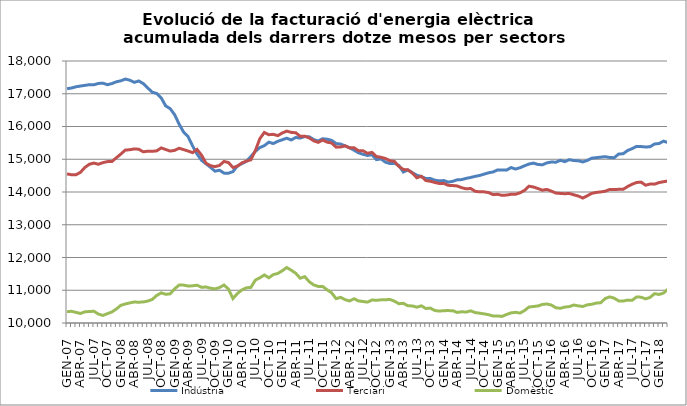
| Category | Indústria | Terciari | Domèstic |
|---|---|---|---|
| GEN-07 | 17155.2 | 14552.5 | 10345.1 |
| FEB-07 | 17174.5 | 14527.6 | 10357.7 |
| MAR-07 | 17212.2 | 14525.6 | 10324.4 |
| ABR-07 | 17235.4 | 14601.6 | 10290.5 |
| MAI-07 | 17255.9 | 14751 | 10341.7 |
| JUN-07 | 17276.5 | 14848.4 | 10351.7 |
| JUL-07 | 17273.3 | 14882.6 | 10358.3 |
| AGO-07 | 17314.5 | 14847.7 | 10272.5 |
| SET-07 | 17324.1 | 14896.7 | 10231.1 |
| OCT-07 | 17275.7 | 14927.4 | 10285.2 |
| NOV-07 | 17310.7 | 14928.7 | 10336 |
| DES-07 | 17364 | 15044.6 | 10428.4 |
| GEN-08 | 17395.5 | 15157.7 | 10539.2 |
| FEB-08 | 17448.3 | 15279.7 | 10581.6 |
| MAR-08 | 17414.6 | 15290.9 | 10613.5 |
| ABR-08 | 17347.9 | 15316.1 | 10641.7 |
| MAI-08 | 17390 | 15305.6 | 10632.9 |
| JUN-08 | 17310.1 | 15226.6 | 10644 |
| JUL-08 | 17178.8 | 15245.8 | 10669.4 |
| AGO-08 | 17046.3 | 15243.1 | 10719.1 |
| SET-08 | 17008.9 | 15255.9 | 10840.3 |
| OCT-08 | 16875.3 | 15346.2 | 10920.3 |
| NOV-08 | 16629.9 | 15297.5 | 10876.6 |
| DES-08 | 16545.4 | 15249.2 | 10889.6 |
| GEN-09 | 16360.1 | 15270.9 | 11043.7 |
| FEB-09 | 16071.4 | 15336.4 | 11158.6 |
| MAR-09 | 15828.8 | 15294.7 | 11156.8 |
| ABR-09 | 15689.6 | 15251.1 | 11128.4 |
| MAI-09 | 15406.5 | 15201.4 | 11135.8 |
| JUN-09 | 15158.3 | 15299.5 | 11154.1 |
| JUL-09 | 14966.7 | 15124.4 | 11089.7 |
| AGO-09 | 14858.4 | 14878.8 | 11098.7 |
| SET-09 | 14752.9 | 14802.4 | 11061.9 |
| OCT-09 | 14635.7 | 14773.8 | 11041.3 |
| NOV-09 | 14665.8 | 14810.7 | 11082.8 |
| DES-09 | 14576.4 | 14932.5 | 11159.5 |
| GEN-10 | 14573.7 | 14899.7 | 11036.8 |
| FEB-10 | 14622.1 | 14747.3 | 10745.5 |
| MAR-10 | 14796.1 | 14789 | 10901.5 |
| ABR-10 | 14865.5 | 14889.7 | 11009.4 |
| MAI-10 | 14938.5 | 14942.8 | 11074.6 |
| JUN-10 | 15084.7 | 14983.7 | 11087.5 |
| JUL-10 | 15240.4 | 15264.9 | 11310.4 |
| AGO-10 | 15356 | 15629.1 | 11380.9 |
| SET-10 | 15416.1 | 15818.8 | 11467.4 |
| OCT-10 | 15520.5 | 15749.9 | 11381.6 |
| NOV-10 | 15479.8 | 15760.5 | 11478.3 |
| DES-10 | 15547 | 15721.1 | 11512.6 |
| GEN-11 | 15595.5 | 15803.1 | 11595.5 |
| FEB-11 | 15642.2 | 15859.3 | 11693.9 |
| MAR-11 | 15589.2 | 15820.3 | 11611.2 |
| ABR-11 | 15665.3 | 15809.3 | 11517.5 |
| MAI-11 | 15646.3 | 15698.4 | 11367 |
| JUN-11 | 15692.3 | 15705.8 | 11415.9 |
| JUL-11 | 15686.5 | 15652 | 11262.8 |
| AGO-11 | 15603.7 | 15563.5 | 11161.9 |
| SET-11 | 15555.7 | 15515.3 | 11115.8 |
| OCT-11 | 15626.6 | 15587 | 11116.5 |
| NOV-11 | 15611.3 | 15521.8 | 11012.6 |
| DES-11 | 15576.8 | 15495.8 | 10921.4 |
| GEN-12 | 15479.3 | 15369.7 | 10743 |
| FEB-12 | 15464.2 | 15374.5 | 10782.7 |
| MAR-12 | 15409.3 | 15409.8 | 10712.7 |
| ABR-12 | 15352.1 | 15346.6 | 10673.4 |
| MAI-12 | 15276.4 | 15351.8 | 10740.8 |
| JUN-12 | 15196.5 | 15260.5 | 10674.3 |
| JUL-12 | 15149.8 | 15259 | 10656.5 |
| AGO-12 | 15115.6 | 15180.5 | 10637.3 |
| SET-12 | 15137.1 | 15209.7 | 10704 |
| OCT-12 | 14988.4 | 15082.2 | 10692.6 |
| NOV-12 | 15009.9 | 15061.2 | 10707.3 |
| DES-12 | 14911 | 15021.8 | 10709.7 |
| GEN-13 | 14867.7 | 14955.1 | 10720 |
| FEB-13 | 14875.2 | 14934 | 10666.5 |
| MAR-13 | 14807.4 | 14778.9 | 10589 |
| ABR-13 | 14609.6 | 14688 | 10601.2 |
| MAI-13 | 14676.1 | 14676.4 | 10525.4 |
| JUN-13 | 14590.2 | 14576.6 | 10521.5 |
| JUL-13 | 14511.6 | 14434.8 | 10482.6 |
| AGO-13 | 14473.2 | 14479.5 | 10524.2 |
| SET-13 | 14412 | 14350 | 10442.9 |
| OCT-13 | 14413.5 | 14328.7 | 10454.8 |
| NOV-13 | 14360.2 | 14291.2 | 10381.8 |
| DES-13 | 14339.2 | 14260 | 10363.6 |
| GEN-14 | 14349.8 | 14264 | 10377.5 |
| FEB-14 | 14302.5 | 14203.5 | 10378.3 |
| MAR-14 | 14324.5 | 14197.4 | 10376.1 |
| ABR-14 | 14372.9 | 14184.6 | 10322.9 |
| MAI-14 | 14378.7 | 14131.3 | 10343.7 |
| JUN-14 | 14416.3 | 14096.4 | 10334 |
| JUL-14 | 14444.2 | 14107.4 | 10371.5 |
| AGO-14 | 14476.7 | 14022.6 | 10317.9 |
| SET-14 | 14504.4 | 14004.4 | 10299 |
| OCT-14 | 14545.9 | 14004.3 | 10278.5 |
| NOV-14 | 14587.2 | 13981.9 | 10253.2 |
| DES-14 | 14611.9 | 13919.4 | 10214.6 |
| GEN-15 | 14673.2 | 13929.7 | 10214.1 |
| FEB-15 | 14675.4 | 13898 | 10201.5 |
| MAR-15 | 14667.7 | 13906.5 | 10259.2 |
| ABR-15 | 14745.6 | 13929.7 | 10308.6 |
| MAI-15 | 14702 | 13928.7 | 10326.5 |
| JUN-15 | 14740.4 | 13974.8 | 10303.1 |
| JUL-15 | 14799.7 | 14048.9 | 10379.2 |
| AGO-15 | 14853.7 | 14177.6 | 10486.8 |
| SET-15 | 14881.3 | 14152.6 | 10503.9 |
| OCT-15 | 14840.5 | 14105.6 | 10520 |
| NOV-15 | 14830 | 14055.4 | 10567 |
| DES-15 | 14889.8 | 14078.7 | 10580.2 |
| GEN-16 | 14915.7 | 14026.4 | 10548.4 |
| FEB-16 | 14909.5 | 13967.1 | 10465.2 |
| MAR-16 | 14967.2 | 13956 | 10449.6 |
| ABR-16 | 14927.2 | 13948 | 10485.6 |
| MAI-16 | 14987.6 | 13954.8 | 10501.1 |
| JUN-16 | 14960.1 | 13914 | 10548.5 |
| JUL-16 | 14953.4 | 13876.7 | 10522.9 |
| AGO-16 | 14918 | 13815.6 | 10504.2 |
| SET-16 | 14963.7 | 13884.4 | 10553.6 |
| OCT-16 | 15032.1 | 13958.8 | 10572.4 |
| NOV-16 | 15048.5 | 13987.1 | 10607.6 |
| DES-16 | 15063.8 | 14003.1 | 10618.3 |
| GEN-17 | 15078.1 | 14024.1 | 10747.9 |
| FEB-17 | 15053.9 | 14076.9 | 10797.1 |
| MAR-17 | 15047.4 | 14073.2 | 10758.6 |
| ABR-17 | 15158.9 | 14081.7 | 10674.7 |
| MAI-17 | 15167.9 | 14081.5 | 10669.7 |
| JUN-17 | 15268.2 | 14166.4 | 10699 |
| JUL-17 | 15323.4 | 14237.6 | 10692.9 |
| AGO-17 | 15393.1 | 14289.8 | 10796 |
| SET-17 | 15387.2 | 14302.5 | 10788.1 |
| OCT-17 | 15374.7 | 14207.3 | 10736.8 |
| NOV-17 | 15381.5 | 14242 | 10781 |
| DES-17 | 15466.2 | 14240.2 | 10895 |
| GEN-18 | 15479.7 | 14288.2 | 10871.6 |
| FEB-18 | 15552.9 | 14313.5 | 10913.6 |
| MAR-18 | 15506.6 | 14337.3 | 11036.1 |